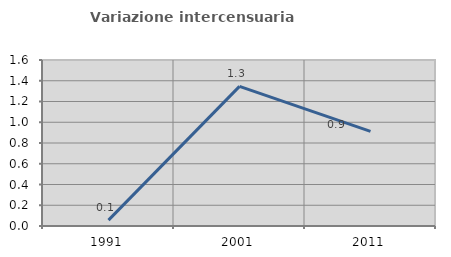
| Category | Variazione intercensuaria annua |
|---|---|
| 1991.0 | 0.056 |
| 2001.0 | 1.346 |
| 2011.0 | 0.913 |